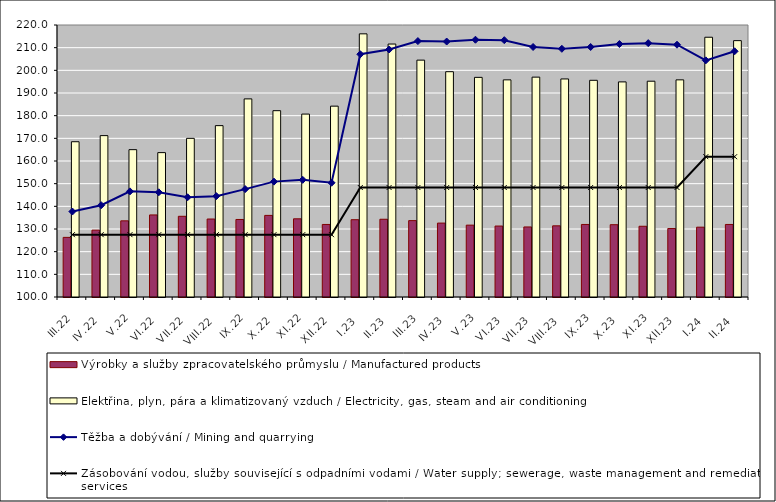
| Category | Výrobky a služby zpracovatelského průmyslu / Manufactured products | Elektřina, plyn, pára a klimatizovaný vzduch / Electricity, gas, steam and air conditioning |
|---|---|---|
| III.22 | 126.3 | 168.5 |
| IV.22 | 129.5 | 171.2 |
| V.22 | 133.6 | 165 |
| VI.22 | 136.2 | 163.7 |
| VII.22 | 135.6 | 170 |
| VIII.22 | 134.4 | 175.6 |
| IX.22 | 134.2 | 187.4 |
| X.22 | 136 | 182.2 |
| XI.22 | 134.5 | 180.7 |
| XII.22 | 132 | 184.2 |
| I.23 | 134.1 | 216.1 |
| II.23 | 134.3 | 211.6 |
| III.23 | 133.7 | 204.5 |
| IV.23 | 132.6 | 199.4 |
| V.23 | 131.7 | 196.9 |
| VI.23 | 131.3 | 195.8 |
| VII.23 | 130.9 | 197 |
| VIII.23 | 131.4 | 196.2 |
| IX.23 | 132 | 195.6 |
| X.23 | 131.9 | 194.9 |
| XI.23 | 131.2 | 195.2 |
| XII.23 | 130.2 | 195.8 |
| I.24 | 130.8 | 214.6 |
| II.24 | 132 | 213.1 |